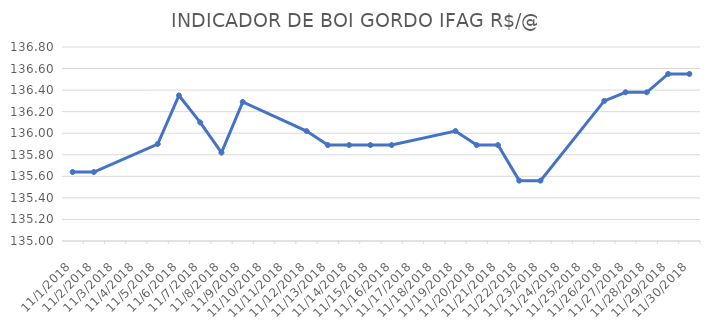
| Category | INDICADOR DE BOI GORDO IFAG |
|---|---|
| 11/1/18 | 135.64 |
| 11/2/18 | 135.64 |
| 11/5/18 | 135.9 |
| 11/6/18 | 136.35 |
| 11/7/18 | 136.1 |
| 11/8/18 | 135.82 |
| 11/9/18 | 136.29 |
| 11/12/18 | 136.02 |
| 11/13/18 | 135.89 |
| 11/14/18 | 135.89 |
| 11/15/18 | 135.89 |
| 11/16/18 | 135.89 |
| 11/19/18 | 136.02 |
| 11/20/18 | 135.89 |
| 11/21/18 | 135.89 |
| 11/22/18 | 135.56 |
| 11/23/18 | 135.56 |
| 11/26/18 | 136.3 |
| 11/27/18 | 136.38 |
| 11/28/18 | 136.38 |
| 11/29/18 | 136.55 |
| 11/30/18 | 136.55 |